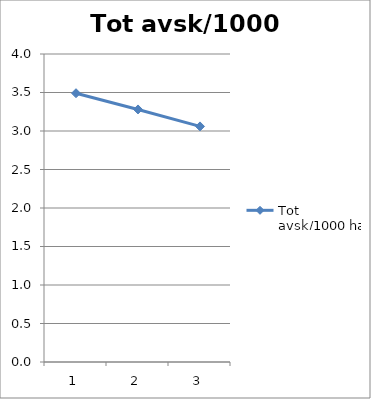
| Category | Tot avsk/1000 ha |
|---|---|
| 0 | 3.49 |
| 1 | 3.28 |
| 2 | 3.059 |